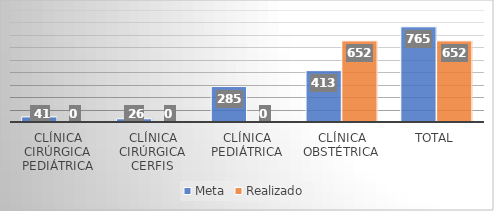
| Category | Meta | Realizado |
|---|---|---|
| Clínica Cirúrgica Pediátrica | 41 | 0 |
| Clínica Cirúrgica CERFIS | 26 | 0 |
| Clínica Pediátrica | 285 | 0 |
| Clínica Obstétrica | 413 | 652 |
| Total | 765 | 652 |